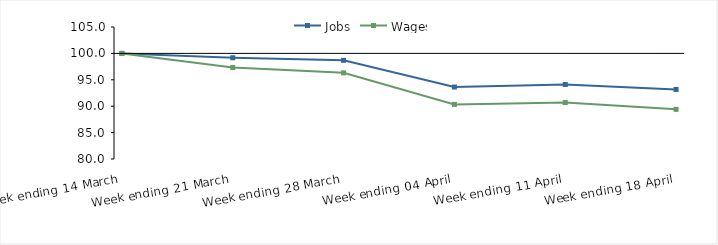
| Category | Jobs | Wages |
|---|---|---|
| 0 | 100 | 100 |
| 1900-01-01 | 99.176 | 97.319 |
| 1900-01-02 | 98.686 | 96.317 |
| 1900-01-03 | 93.63 | 90.338 |
| 1900-01-04 | 94.106 | 90.689 |
| 1900-01-05 | 93.176 | 89.405 |